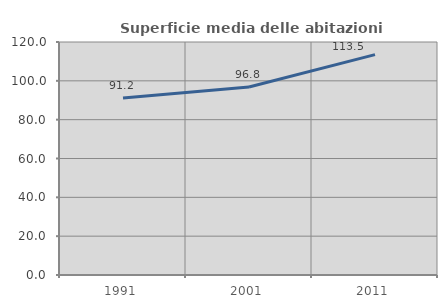
| Category | Superficie media delle abitazioni occupate |
|---|---|
| 1991.0 | 91.202 |
| 2001.0 | 96.798 |
| 2011.0 | 113.5 |